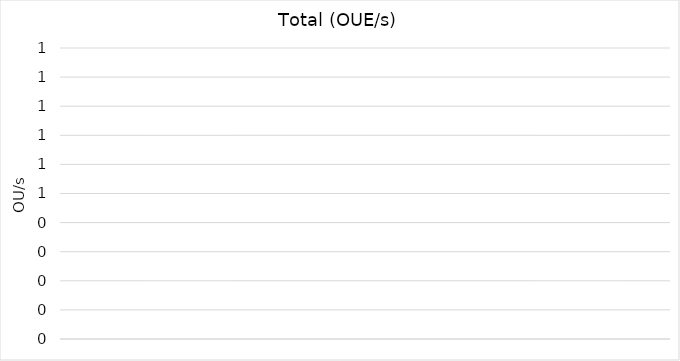
| Category | Total (OUE/s) |
|---|---|
|  | 0 |
|  | 0 |
|  | 0 |
|  | 0 |
|  | 0 |
|  | 0 |
|  | 0 |
|  | 0 |
|  | 0 |
|  | 0 |
|  | 0 |
|  | 0 |
|  | 0 |
|  | 0 |
|  | 0 |